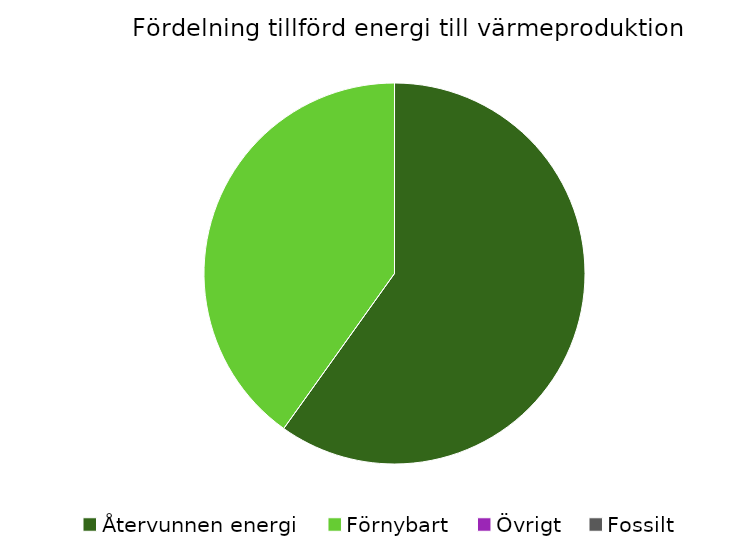
| Category | Fördelning värmeproduktion |
|---|---|
| Återvunnen energi | 0.599 |
| Förnybart | 0.401 |
| Övrigt | 0 |
| Fossilt | 0 |